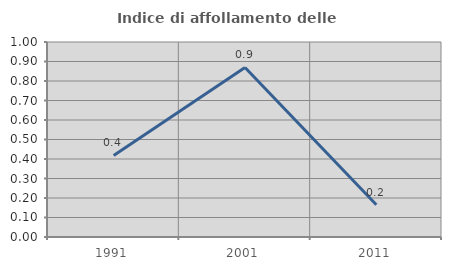
| Category | Indice di affollamento delle abitazioni  |
|---|---|
| 1991.0 | 0.418 |
| 2001.0 | 0.87 |
| 2011.0 | 0.165 |